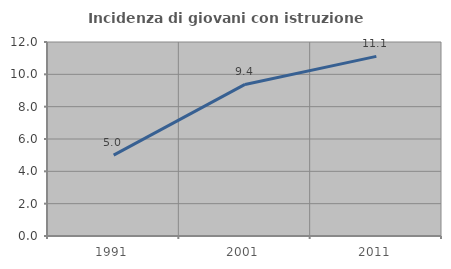
| Category | Incidenza di giovani con istruzione universitaria |
|---|---|
| 1991.0 | 5 |
| 2001.0 | 9.375 |
| 2011.0 | 11.111 |